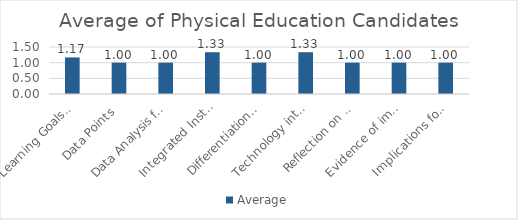
| Category | Average |
|---|---|
| Learning Goals Aligned with Pre-/Post-assessments ACEI 4.0 | 1.167 |
| Data Points | 1 |
| Data Analysis for Pedagogical Decisions ACEI 4.0 | 1 |
| Integrated Instruction ACEI 3.1 | 1.333 |
| Differentiation based on knowledge of individual learning ACEI 3.2 | 1 |
| Technology integration | 1.333 |
| Reflection on pedagogical decisions ACEI 1.0 | 1 |
| Evidence of impact on student learning ACEI 5.1 | 1 |
| Implications for teaching and professional development ACEI 5.1 | 1 |